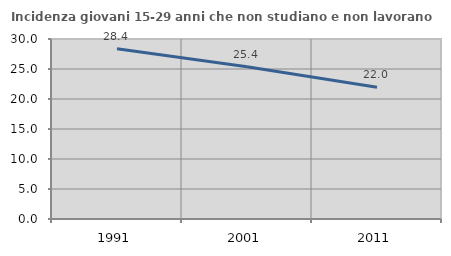
| Category | Incidenza giovani 15-29 anni che non studiano e non lavorano  |
|---|---|
| 1991.0 | 28.378 |
| 2001.0 | 25.381 |
| 2011.0 | 21.954 |